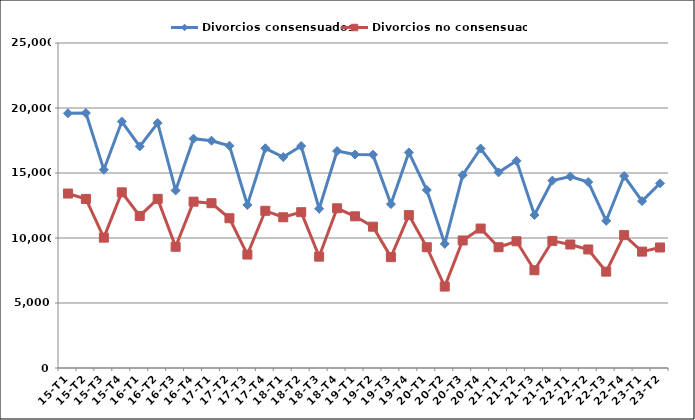
| Category | Divorcios consensuados | Divorcios no consensuados |
|---|---|---|
| 15-T1 | 19595 | 13420 |
| 15-T2 | 19612 | 13004 |
| 15-T3 | 15249 | 10027 |
| 15-T4 | 18958 | 13512 |
| 16-T1 | 17041 | 11699 |
| 16-T2 | 18847 | 13011 |
| 16-T3 | 13660 | 9325 |
| 16-T4 | 17641 | 12795 |
| 17-T1 | 17483 | 12679 |
| 17-T2 | 17095 | 11520 |
| 17-T3 | 12545 | 8727 |
| 17-T4 | 16901 | 12093 |
| 18-T1 | 16226 | 11594 |
| 18-T2 | 17077 | 11986 |
| 18-T3 | 12249 | 8566 |
| 18-T4 | 16689 | 12287 |
| 19-T1 | 16423 | 11668 |
| 19-T2 | 16409 | 10869 |
| 19-T3 | 12607 | 8528 |
| 19-T4 | 16581 | 11761 |
| 20-T1 | 13690 | 9290 |
| 20-T2 | 9552 | 6264 |
| 20-T3 | 14835 | 9809 |
| 20-T4 | 16883 | 10727 |
| 21-T1 | 15048 | 9290 |
| 21-T2 | 15937 | 9750 |
| 21-T3 | 11767 | 7520 |
| 21-T4 | 14416 | 9777 |
| 22-T1 | 14730 | 9498 |
| 22-T2 | 14306 | 9118 |
| 22-T3 | 11321 | 7413 |
| 22-T4 | 14766 | 10221 |
| 23-T1 | 12839 | 8954 |
| 23-T2 | 14208 | 9269 |